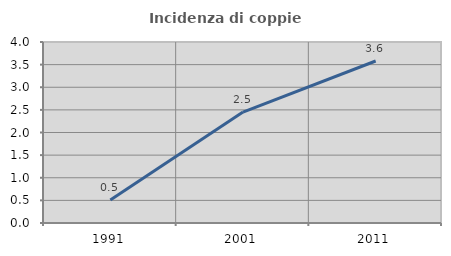
| Category | Incidenza di coppie miste |
|---|---|
| 1991.0 | 0.51 |
| 2001.0 | 2.451 |
| 2011.0 | 3.58 |